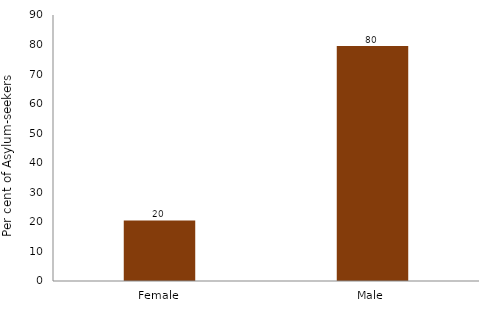
| Category | Series 0 |
|---|---|
| Female | 20.497 |
| Male | 79.503 |